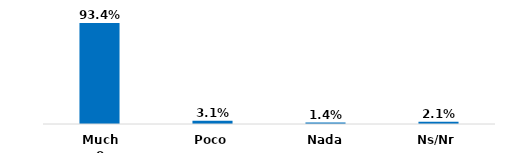
| Category | Series 0 |
|---|---|
| Mucho | 0.934 |
| Poco | 0.031 |
| Nada | 0.014 |
| Ns/Nr | 0.021 |